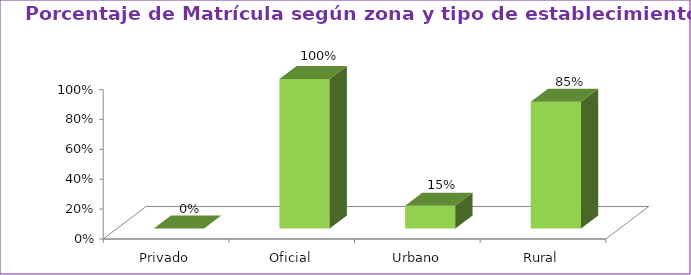
| Category | Series 1 |
|---|---|
| Privado | 0 |
| Oficial | 1 |
| Urbano | 0.152 |
| Rural | 0.848 |